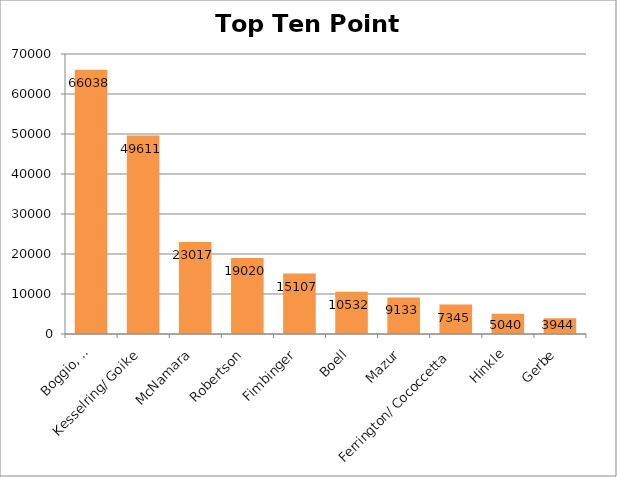
| Category | Series 0 |
|---|---|
| Boggio, R. | 66038 |
| Kesselring/ Goike | 49611 |
| McNamara | 23017 |
| Robertson | 19020 |
| Fimbinger | 15107 |
| Boell | 10532 |
| Mazur | 9133 |
| Ferrington/ Cococcetta | 7345 |
| Hinkle | 5040 |
| Gerbe | 3944 |